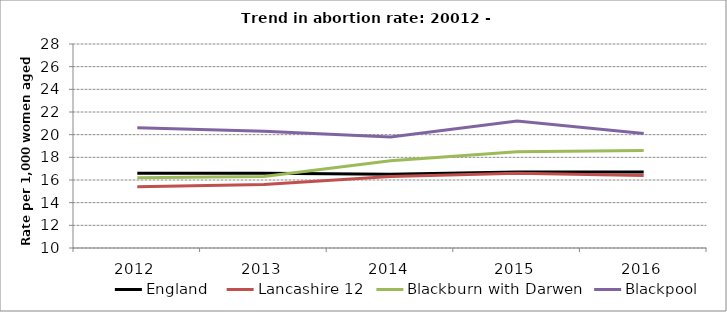
| Category | England  | Lancashire 12 | Blackburn with Darwen | Blackpool |
|---|---|---|---|---|
| 2012.0 | 16.6 | 15.4 | 16.2 | 20.6 |
| 2013.0 | 16.6 | 15.6 | 16.3 | 20.3 |
| 2014.0 | 16.5 | 16.3 | 17.7 | 19.8 |
| 2015.0 | 16.7 | 16.6 | 18.5 | 21.2 |
| 2016.0 | 16.7 | 16.4 | 18.6 | 20.1 |